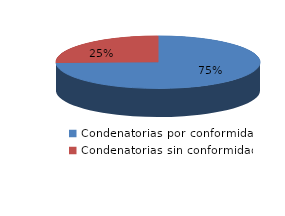
| Category | Series 0 |
|---|---|
| 0 | 38 |
| 1 | 13 |